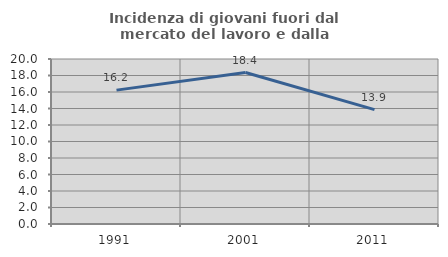
| Category | Incidenza di giovani fuori dal mercato del lavoro e dalla formazione  |
|---|---|
| 1991.0 | 16.226 |
| 2001.0 | 18.359 |
| 2011.0 | 13.866 |